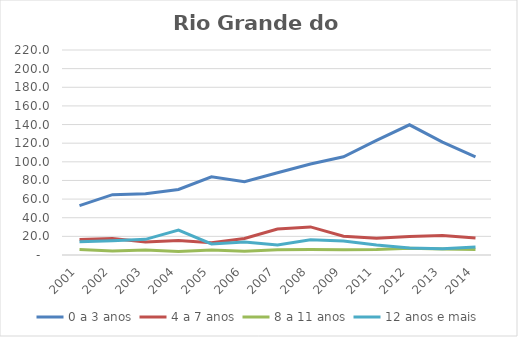
| Category | 0 a 3 anos | 4 a 7 anos | 8 a 11 anos | 12 anos e mais |
|---|---|---|---|---|
| 2001.0 | 53.003 | 16.62 | 5.795 | 14.268 |
| 2002.0 | 64.788 | 17.592 | 4.189 | 15.179 |
| 2003.0 | 65.816 | 13.979 | 5.297 | 16.787 |
| 2004.0 | 70.321 | 15.487 | 3.667 | 26.748 |
| 2005.0 | 83.956 | 13.263 | 5.343 | 11.87 |
| 2006.0 | 78.724 | 17.709 | 4.14 | 14.075 |
| 2007.0 | 88.34 | 27.932 | 5.593 | 10.836 |
| 2008.0 | 97.723 | 30.137 | 5.835 | 16.232 |
| 2009.0 | 105.357 | 20.091 | 5.623 | 15.012 |
| 2011.0 | 122.936 | 18.048 | 5.81 | 10.702 |
| 2012.0 | 139.725 | 19.771 | 7.159 | 7.608 |
| 2013.0 | 121.076 | 20.893 | 6.545 | 6.77 |
| 2014.0 | 105.297 | 18.293 | 5.904 | 8.496 |